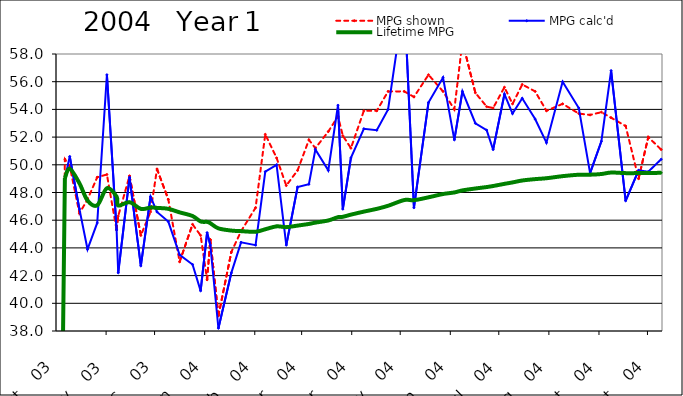
| Category | MPG shown | MPG calc'd | Lifetime MPG |
|---|---|---|---|
| 2003-10-23 | 0 | 0 | 0 |
| 2003-10-28 | 50.4 | 49 | 49.042 |
| 2003-10-31 | 49.9 | 50.6 | 49.718 |
| 2003-11-06 | 46.5 | 46.8 | 48.666 |
| 2003-11-11 | 47.5 | 43.9 | 47.424 |
| 2003-11-17 | 49.1 | 45.8 | 47.075 |
| 2003-11-23 | 49.3 | 56.5 | 48.309 |
| 2003-11-29 | 45.3 | 45.3 | 47.7 |
| 2003-11-30 | 46.3 | 42.2 | 47.056 |
| 2003-12-07 | 49.2 | 49.1 | 47.299 |
| 2003-12-14 | 44.9 | 42.7 | 46.817 |
| 2003-12-20 | 46.6 | 47.7 | 46.912 |
| 2003-12-24 | 49.7 | 46.6 | 46.889 |
| 2003-12-31 | 47.5 | 45.9 | 46.822 |
| 2004-01-07 | 43 | 43.5 | 46.566 |
| 2004-01-15 | 45.7 | 42.8 | 46.301 |
| 2004-01-20 | 44.9 | 40.9 | 45.909 |
| 2004-01-24 | 41.7 | 45.1 | 45.878 |
| 2004-01-26 | 44.6 | 44.2 | 45.78 |
| 2004-01-31 | 39.1 | 38.2 | 45.411 |
| 2004-02-08 | 43.7 | 42.2 | 45.251 |
| 2004-02-14 | 45.2 | 44.4 | 45.21 |
| 2004-02-23 | 46.9 | 44.2 | 45.165 |
| 2004-02-29 | 52.2 | 49.5 | 45.346 |
| 2004-03-07 | 50.5 | 50 | 45.555 |
| 2004-03-13 | 48.5 | 44.2 | 45.499 |
| 2004-03-20 | 49.6 | 48.4 | 45.61 |
| 2004-03-27 | 51.8 | 48.6 | 45.73 |
| 2004-03-31 | 51.2 | 51.1 | 45.825 |
| 2004-04-08 | 52.4 | 49.6 | 45.981 |
| 2004-04-14 | 53.5 | 54.3 | 46.221 |
| 2004-04-17 | 52.1 | 46.8 | 46.245 |
| 2004-04-22 | 51.2 | 50.5 | 46.401 |
| 2004-04-30 | 53.9 | 52.6 | 46.619 |
| 2004-05-08 | 53.9 | 52.5 | 46.819 |
| 2004-05-15 | 55.3 | 54 | 47.041 |
| 2004-05-25 | 55.3 | 62 | 47.456 |
| 2004-05-31 | 54.9 | 46.9 | 47.443 |
| 2004-06-09 | 56.5 | 54.5 | 47.652 |
| 2004-06-18 | 55.3 | 56.3 | 47.89 |
| 2004-06-25 | 54 | 51.8 | 48.004 |
| 2004-06-30 | 58.9 | 55.3 | 48.152 |
| 2004-07-08 | 55.2 | 53 | 48.289 |
| 2004-07-15 | 54.2 | 52.5 | 48.394 |
| 2004-07-19 | 54.1 | 51.1 | 48.468 |
| 2004-07-26 | 55.6 | 55.1 | 48.625 |
| 2004-07-31 | 54.4 | 53.7 | 48.727 |
| 2004-08-06 | 55.8 | 54.8 | 48.866 |
| 2004-08-14 | 55.3 | 53.3 | 48.966 |
| 2004-08-21 | 53.9 | 51.6 | 49.03 |
| 2004-08-31 | 54.4 | 56 | 49.18 |
| 2004-09-10 | 53.7 | 54.1 | 49.283 |
| 2004-09-17 | 53.6 | 49.4 | 49.286 |
| 2004-09-24 | 53.8 | 51.7 | 49.334 |
| 2004-09-30 | 53.4 | 56.8 | 49.441 |
| 2004-10-09 | 52.8 | 47.4 | 49.398 |
| 2004-10-17 | 49 | 49.6 | 49.402 |
| 2004-10-23 | 52 | 49.5 | 49.406 |
| 2004-10-31 | 51.1 | 50.4 | 49.422 |